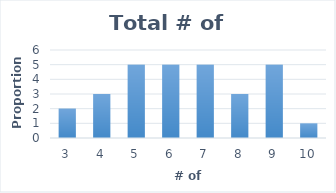
| Category | # |
|---|---|
| 3.0 | 2 |
| 4.0 | 3 |
| 5.0 | 5 |
| 6.0 | 5 |
| 7.0 | 5 |
| 8.0 | 3 |
| 9.0 | 5 |
| 10.0 | 1 |